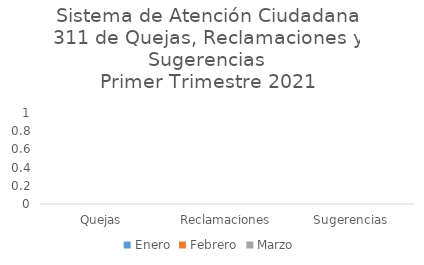
| Category | Enero | Febrero | Marzo |
|---|---|---|---|
| Quejas | 0 | 0 | 0 |
| Reclamaciones | 0 | 0 | 0 |
| Sugerencias | 0 | 0 | 0 |